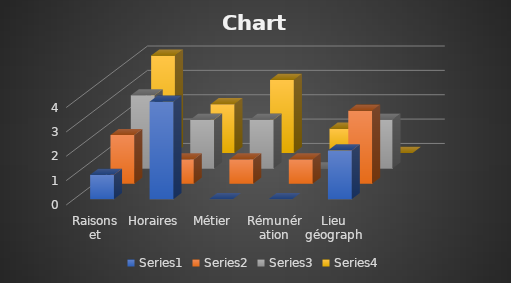
| Category | Series 0 | Series 1 | Series 2 | Series 3 |
|---|---|---|---|---|
| Raisons et classement | 1 | 2 | 3 | 4 |
| Horaires | 4 | 1 | 2 | 2 |
| Métier | 0 | 1 | 2 | 3 |
| Rémunération | 0 | 1 | 0 | 1 |
| Lieu géographique | 2 | 3 | 2 | 0 |